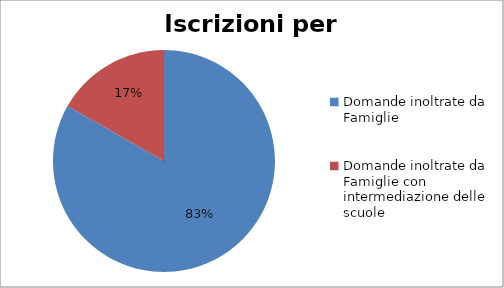
| Category | Series 0 |
|---|---|
| Domande inoltrate da Famiglie | 92082 |
| Domande inoltrate da Famiglie con intermediazione delle scuole | 18547 |